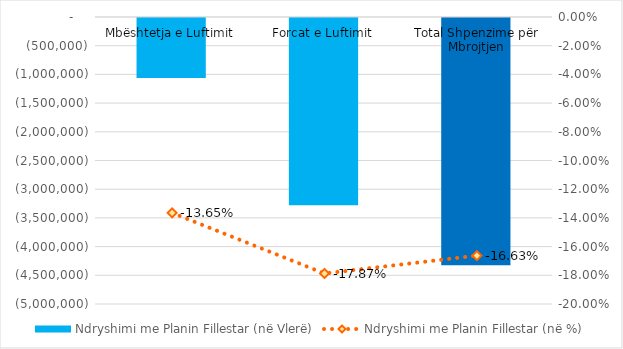
| Category | Ndryshimi me Planin Fillestar (në Vlerë) |
|---|---|
| Mbështetja e Luftimit | -1045555 |
| Forcat e Luftimit | -3264050 |
| Total Shpenzime për Mbrojtjen | -4309605 |